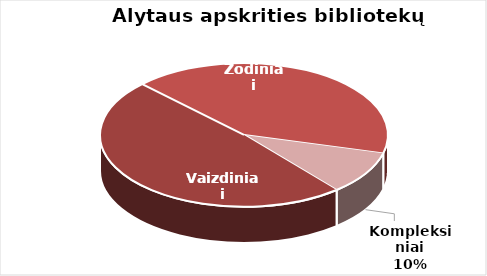
| Category | Series 0 |
|---|---|
| Vaizdiniai | 1455 |
| Žodiniai | 1246 |
| Kompleksiniai | 292 |